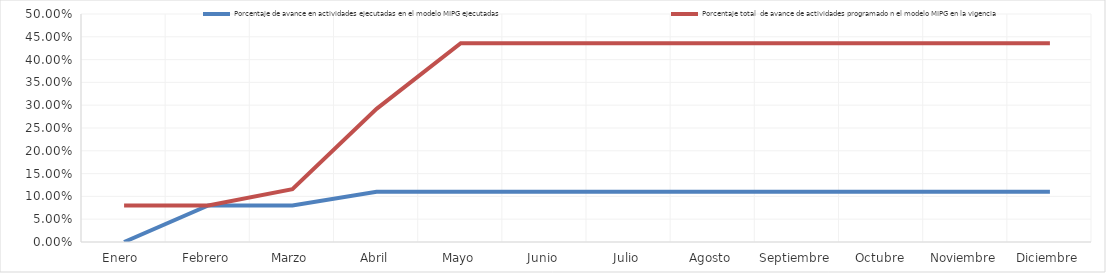
| Category | Porcentaje de avance en actividades ejecutadas en el modelo MIPG ejecutadas | Porcentaje total  de avance de actividades programado n el modelo MIPG en la vigencia |
|---|---|---|
| Enero  | 0 | 0.08 |
| Febrero | 0.08 | 0.08 |
| Marzo | 0.08 | 0.116 |
| Abril | 0.11 | 0.292 |
| Mayo | 0.11 | 0.436 |
| Junio | 0.11 | 0.436 |
| Julio | 0.11 | 0.436 |
| Agosto | 0.11 | 0.436 |
| Septiembre | 0.11 | 0.436 |
| Octubre | 0.11 | 0.436 |
| Noviembre | 0.11 | 0.436 |
| Diciembre | 0.11 | 0.436 |